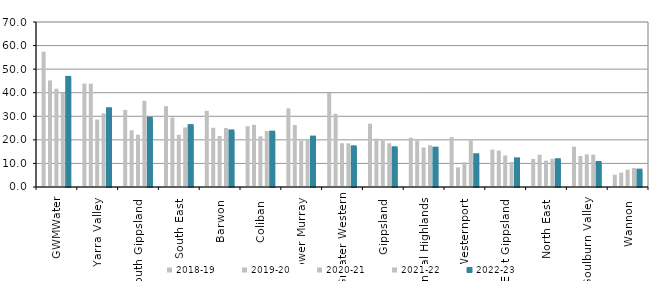
| Category | 2018-19 | 2019-20 | 2020-21 | 2021-22 | 2022-23 |
|---|---|---|---|---|---|
| GWMWater | 57.381 | 45.238 | 41.721 | 39.917 | 46.275 |
| Yarra Valley  | 43.885 | 43.832 | 28.615 | 31.271 | 32.996 |
| South Gippsland  | 32.705 | 24.059 | 22.173 | 36.575 | 28.954 |
| South East  | 34.281 | 29.462 | 22.146 | 25.256 | 25.846 |
| Barwon  | 32.333 | 25.124 | 21.616 | 25.055 | 23.57 |
| Coliban  | 25.813 | 26.375 | 21.477 | 23.706 | 23.05 |
| Lower Murray  | 33.365 | 26.327 | 19.572 | 20.402 | 20.958 |
| Greater Western | 39.885 | 31.054 | 18.582 | 18.493 | 16.822 |
| Gippsland  | 26.866 | 20.489 | 19.708 | 18.523 | 16.435 |
| Central Highlands  | 20.918 | 19.723 | 16.762 | 17.691 | 16.275 |
| Westernport  | 21.154 | 8.316 | 10.52 | 19.808 | 13.469 |
| East Gippsland  | 15.871 | 15.444 | 13.361 | 10.617 | 11.721 |
| North East  | 11.898 | 13.695 | 11.168 | 11.958 | 11.357 |
| Goulburn Valley  | 17.094 | 13.159 | 13.864 | 13.734 | 10.197 |
| Wannon  | 5.211 | 6.111 | 7.345 | 8.022 | 6.944 |